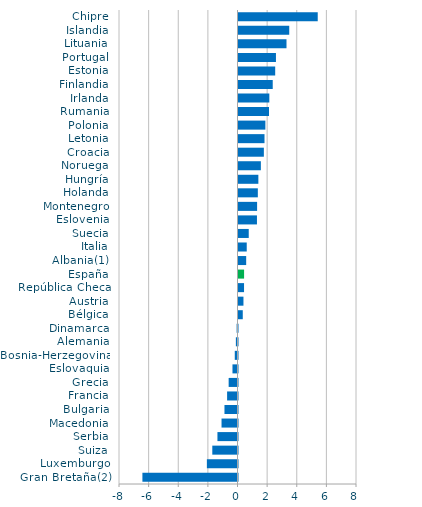
| Category | Series 0 |
|---|---|
| Gran Bretaña(2) | -6.42 |
| Luxemburgo | -2.068 |
| Suiza | -1.701 |
| Serbia | -1.354 |
| Macedonia | -1.078 |
| Bulgaria | -0.88 |
| Francia | -0.702 |
| Grecia | -0.597 |
| Eslovaquia | -0.339 |
| Bosnia-Herzegovina | -0.184 |
| Alemania | -0.11 |
| Dinamarca | -0.058 |
| Bélgica | 0.288 |
| Austria | 0.334 |
| República Checa | 0.374 |
| España | 0.377 |
| Albania(1) | 0.519 |
| Italia | 0.556 |
| Suecia | 0.691 |
| Eslovenia | 1.246 |
| Montenegro | 1.256 |
| Holanda | 1.305 |
| Hungría | 1.341 |
| Noruega | 1.509 |
| Croacia | 1.712 |
| Letonia | 1.755 |
| Polonia | 1.814 |
| Rumania | 2.059 |
| Irlanda | 2.082 |
| Finlandia | 2.311 |
| Estonia | 2.478 |
| Portugal | 2.528 |
| Lituania | 3.24 |
| Islandia | 3.426 |
| Chipre | 5.349 |